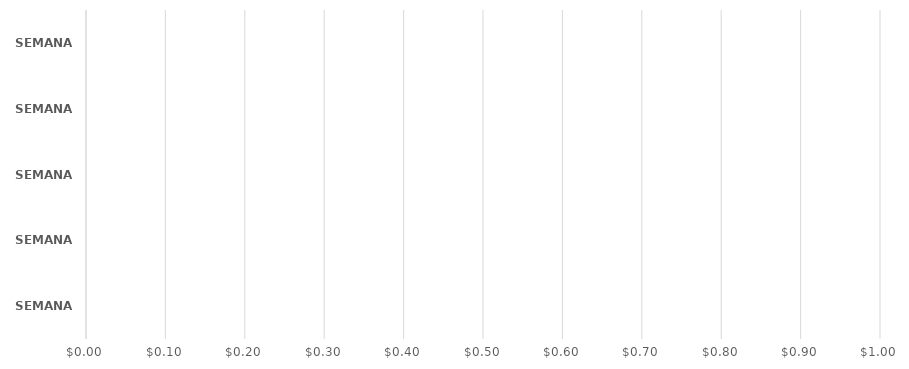
| Category | Series 0 |
|---|---|
| SEMANA 1 | 0 |
| SEMANA 2 | 0 |
| SEMANA 3 | 0 |
| SEMANA 4 | 0 |
| SEMANA 5 | 0 |